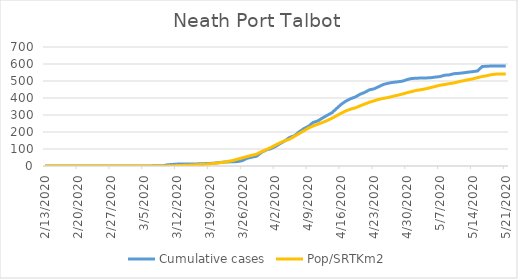
| Category | Cumulative cases | Pop/SRTKm2 |
|---|---|---|
| 5/21/20 | 588 | 540.559 |
| 5/20/20 | 588 | 540.559 |
| 5/19/20 | 588 | 540.432 |
| 5/18/20 | 588 | 537.469 |
| 5/17/20 | 587 | 531.163 |
| 5/16/20 | 585 | 526.464 |
| 5/15/20 | 559 | 519.861 |
| 5/14/20 | 555 | 512.539 |
| 5/13/20 | 552 | 507.459 |
| 5/12/20 | 548 | 501.618 |
| 5/11/20 | 545 | 495.819 |
| 5/10/20 | 543 | 488.624 |
| 5/9/20 | 536 | 484.433 |
| 5/8/20 | 534 | 479.185 |
| 5/7/20 | 526 | 474.952 |
| 5/6/20 | 523 | 467.968 |
| 5/5/20 | 519 | 460.984 |
| 5/4/20 | 518 | 454.254 |
| 5/3/20 | 518 | 448.836 |
| 5/2/20 | 516 | 444.858 |
| 5/1/20 | 515 | 437.789 |
| 4/30/20 | 508 | 431.101 |
| 4/29/20 | 499 | 422.975 |
| 4/28/20 | 495 | 416.075 |
| 4/27/20 | 492 | 409.895 |
| 4/26/20 | 487 | 402.954 |
| 4/25/20 | 480 | 397.917 |
| 4/24/20 | 467 | 392.203 |
| 4/23/20 | 454 | 383.441 |
| 4/22/20 | 448 | 375.06 |
| 4/21/20 | 433 | 364.436 |
| 4/20/20 | 422 | 353.727 |
| 4/19/20 | 406 | 342.088 |
| 4/18/20 | 396 | 334.553 |
| 4/17/20 | 382 | 324.268 |
| 4/16/20 | 363 | 310.638 |
| 4/15/20 | 338 | 295.443 |
| 4/14/20 | 313 | 280.417 |
| 4/13/20 | 298 | 267.296 |
| 4/12/20 | 282 | 255.994 |
| 4/11/20 | 265 | 245.709 |
| 4/10/20 | 256 | 235.381 |
| 4/9/20 | 233 | 222.683 |
| 4/8/20 | 219 | 206.175 |
| 4/7/20 | 200 | 189.964 |
| 4/6/20 | 177 | 174.049 |
| 4/5/20 | 168 | 158.007 |
| 4/4/20 | 148 | 148.653 |
| 4/3/20 | 132 | 136.759 |
| 4/2/20 | 115 | 123.045 |
| 4/1/20 | 102 | 108.95 |
| 3/31/20 | 94 | 95.405 |
| 3/30/20 | 80 | 83.935 |
| 3/29/20 | 58 | 69.797 |
| 3/28/20 | 52 | 63.194 |
| 3/27/20 | 46 | 56.168 |
| 3/26/20 | 32 | 48.338 |
| 3/25/20 | 26 | 40.973 |
| 3/24/20 | 25 | 33.227 |
| 3/23/20 | 24 | 27.513 |
| 3/22/20 | 23 | 22.01 |
| 3/21/20 | 20 | 18.793 |
| 3/20/20 | 17 | 15.619 |
| 3/19/20 | 15 | 12.571 |
| 3/18/20 | 14 | 10.032 |
| 3/17/20 | 13 | 8.55 |
| 3/16/20 | 12 | 6.984 |
| 3/15/20 | 12 | 5.545 |
| 3/14/20 | 12 | 4.317 |
| 3/13/20 | 12 | 3.513 |
| 3/12/20 | 11 | 2.37 |
| 3/11/20 | 9 | 1.354 |
| 3/10/20 | 7 | 0.762 |
| 3/9/20 | 1 | 0.296 |
| 3/8/20 | 1 | 0.169 |
| 3/7/20 | 1 | 0.169 |
| 3/6/20 | 0 | 0.085 |
| 3/5/20 | 0 | 0.085 |
| 3/4/20 | 0 | 0.085 |
| 3/3/20 | 0 | 0.042 |
| 3/2/20 | 0 | 0.042 |
| 3/1/20 | 0 | 0.042 |
| 2/29/20 | 0 | 0.042 |
| 2/28/20 | 0 | 0.042 |
| 2/27/20 | 0 | 0.042 |
| 2/26/20 | 0 | 0 |
| 2/25/20 | 0 | 0 |
| 2/24/20 | 0 | 0 |
| 2/23/20 | 0 | 0 |
| 2/22/20 | 0 | 0 |
| 2/21/20 | 0 | 0 |
| 2/20/20 | 0 | 0 |
| 2/19/20 | 0 | 0 |
| 2/18/20 | 0 | 0 |
| 2/17/20 | 0 | 0 |
| 2/16/20 | 0 | 0 |
| 2/15/20 | 0 | 0 |
| 2/14/20 | 0 | 0 |
| 2/13/20 | 0 | 0 |